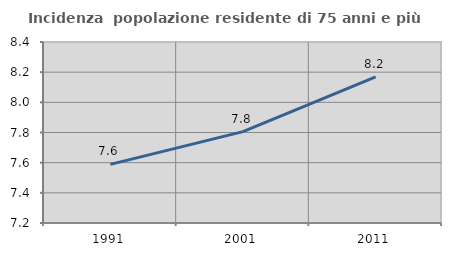
| Category | Incidenza  popolazione residente di 75 anni e più |
|---|---|
| 1991.0 | 7.589 |
| 2001.0 | 7.806 |
| 2011.0 | 8.169 |